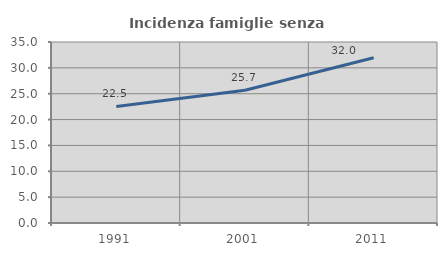
| Category | Incidenza famiglie senza nuclei |
|---|---|
| 1991.0 | 22.532 |
| 2001.0 | 25.667 |
| 2011.0 | 31.967 |